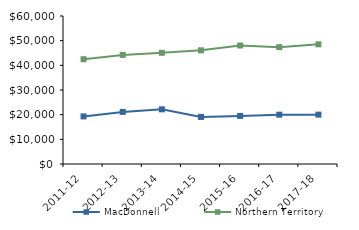
| Category | MacDonnell | Northern Territory |
|---|---|---|
| 2011-12 | 19296 | 42481 |
| 2012-13 | 21123.21 | 44232.02 |
| 2013-14 | 22168.95 | 45075.51 |
| 2014-15 | 19084 | 46083.65 |
| 2015-16 | 19499.81 | 48046.27 |
| 2016-17 | 19986.41 | 47367.05 |
| 2017-18 | 20015 | 48519 |